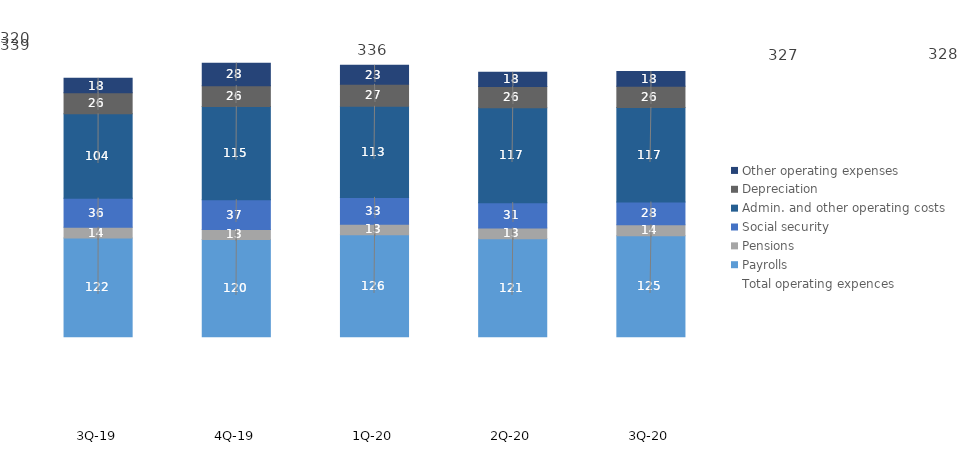
| Category | Payrolls | Pensions | Social security | Admin. and other operating costs | Depreciation | Other operating expenses |
|---|---|---|---|---|---|---|
| 3Q-20 | 124.922 | 13.51 | 28.236 | 117.066 | 26.116 | 18.311 |
| 2Q-20 | 121.292 | 13.37 | 31.266 | 117.403 | 26.314 | 17.514 |
| 1Q-20 | 126.236 | 12.924 | 33.263 | 112.75 | 27.262 | 23.365 |
| 4Q-19 | 120.223 | 12.54 | 36.799 | 115.196 | 25.974 | 27.802 |
| 3Q-19 | 122.031 | 13.58 | 35.843 | 104.32 | 26.181 | 17.805 |